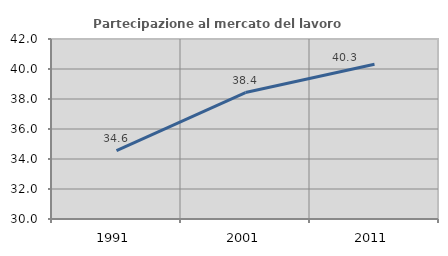
| Category | Partecipazione al mercato del lavoro  femminile |
|---|---|
| 1991.0 | 34.557 |
| 2001.0 | 38.43 |
| 2011.0 | 40.314 |